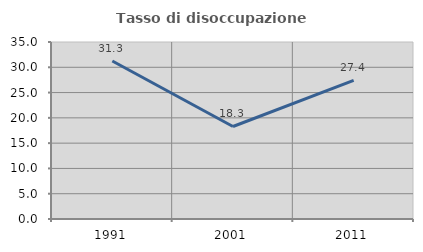
| Category | Tasso di disoccupazione giovanile  |
|---|---|
| 1991.0 | 31.25 |
| 2001.0 | 18.293 |
| 2011.0 | 27.419 |